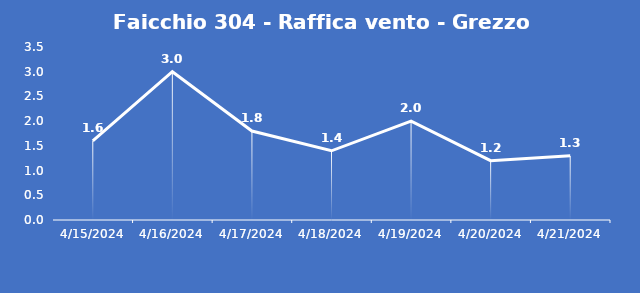
| Category | Faicchio 304 - Raffica vento - Grezzo (m/s) |
|---|---|
| 4/15/24 | 1.6 |
| 4/16/24 | 3 |
| 4/17/24 | 1.8 |
| 4/18/24 | 1.4 |
| 4/19/24 | 2 |
| 4/20/24 | 1.2 |
| 4/21/24 | 1.3 |